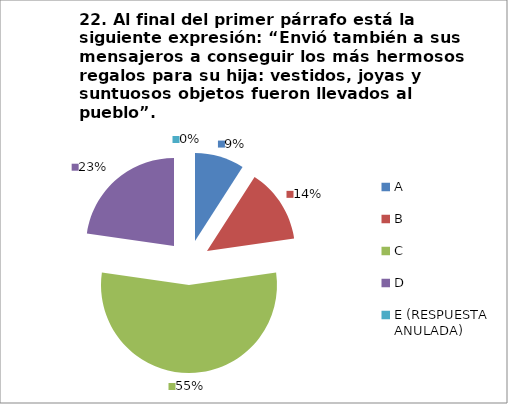
| Category | CANTIDAD DE RESPUESTAS PREGUNTA (22) | PORCENTAJE |
|---|---|---|
| A | 2 | 0.091 |
| B | 3 | 0.136 |
| C | 12 | 0.545 |
| D | 5 | 0.227 |
| E (RESPUESTA ANULADA) | 0 | 0 |